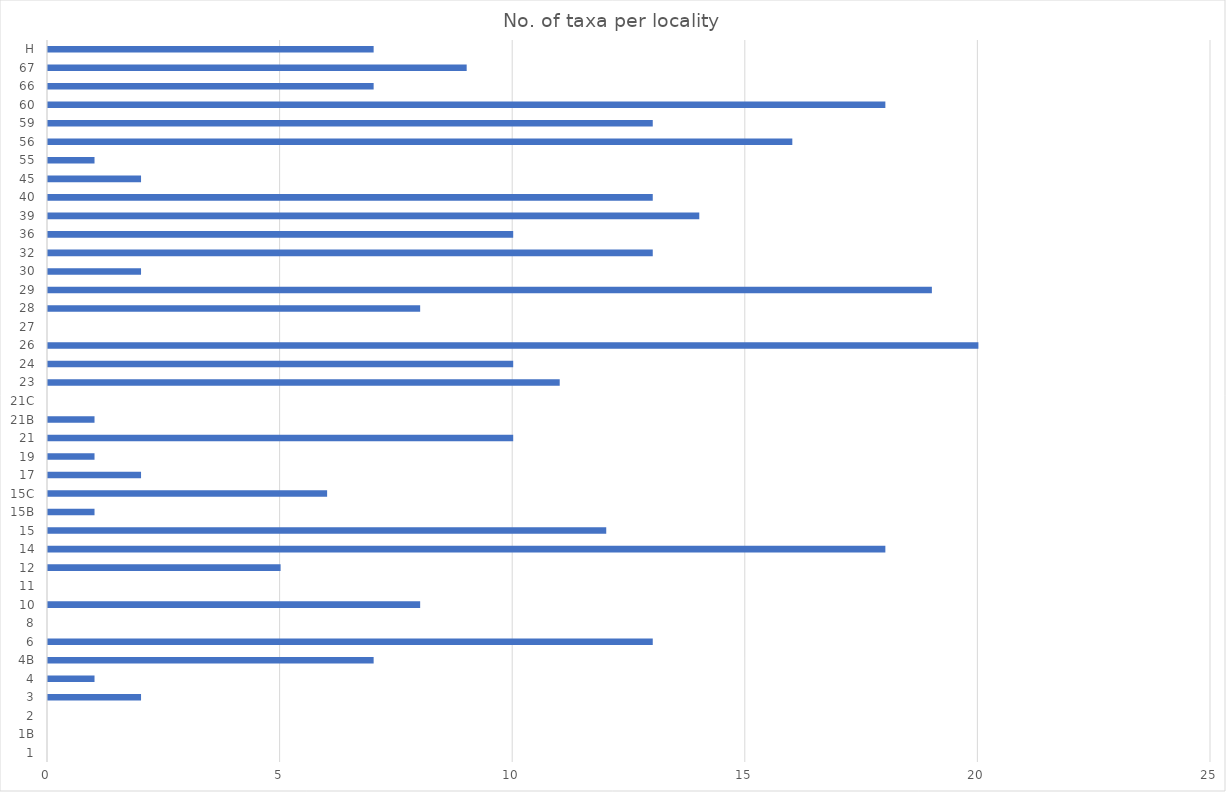
| Category | Series 0 |
|---|---|
| 1 | 0 |
| 1B | 0 |
| 2 | 0 |
| 3 | 2 |
| 4 | 1 |
| 4B | 7 |
| 6 | 13 |
| 8 | 0 |
| 10 | 8 |
| 11 | 0 |
| 12 | 5 |
| 14 | 18 |
| 15 | 12 |
| 15B | 1 |
| 15C | 6 |
| 17 | 2 |
| 19 | 1 |
| 21 | 10 |
| 21B | 1 |
| 21C | 0 |
| 23 | 11 |
| 24 | 10 |
| 26 | 20 |
| 27 | 0 |
| 28 | 8 |
| 29 | 19 |
| 30 | 2 |
| 32 | 13 |
| 36 | 10 |
| 39 | 14 |
| 40 | 13 |
| 45 | 2 |
| 55 | 1 |
| 56 | 16 |
| 59 | 13 |
| 60 | 18 |
| 66 | 7 |
| 67 | 9 |
| H | 7 |